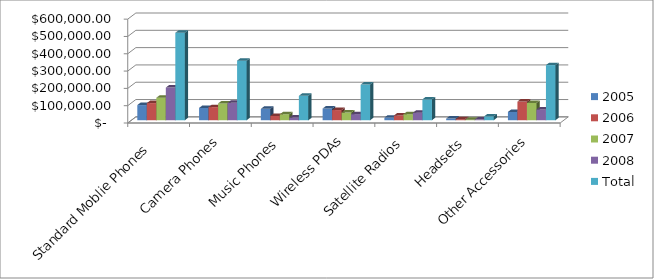
| Category | 2005 | 2006 | 2007 | 2008 | Total |
|---|---|---|---|---|---|
| Standard Moblie Phones  | 87598 | 99087 | 129791 | 188785 | 505261 |
| Camera Phones | 71035 | 75909 | 96886 | 100512 | 344342 |
| Music Phones | 65942 | 24923 | 34590 | 15696 | 141151 |
| Wireless PDAs | 67604 | 58793 | 44483 | 35095 | 205975 |
| Satellite Radios | 15161 | 27293 | 34763 | 43367 | 120584 |
| Headsets | 9549 | 6264 | 2600 | 4048 | 22461 |
| Other Accessories | 47963 | 108059 | 100025 | 62367 | 318414 |